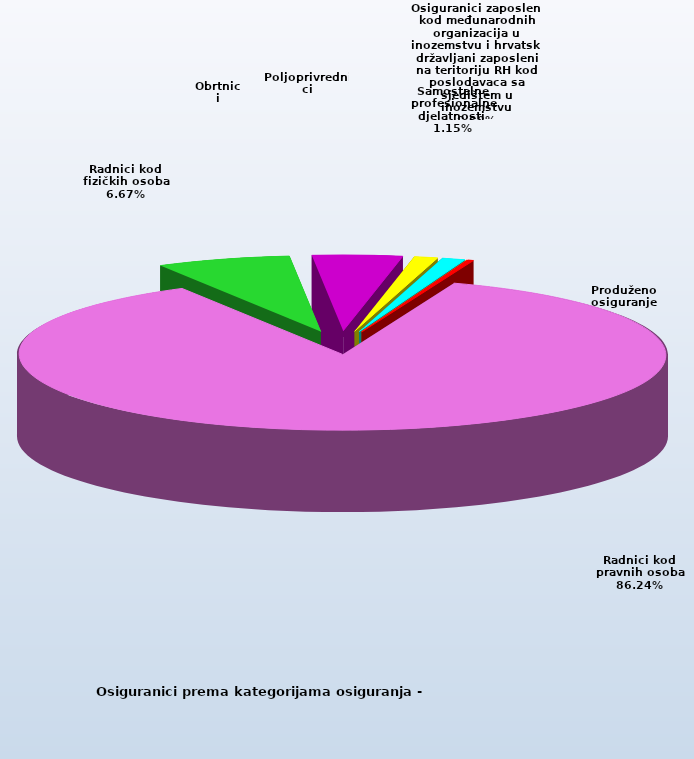
| Category | Series 0 |
|---|---|
| Radnici kod pravnih osoba | 1367615 |
| Radnici kod fizičkih osoba | 105716 |
| Obrtnici | 70872 |
| Poljoprivrednici | 18609 |
| Samostalne profesionalne djelatnosti  | 18222 |
| Osiguranici zaposleni kod međunarodnih organizacija u inozemstvu i hrvatski državljani zaposleni na teritoriju RH kod poslodavaca sa sjedištem u inozemstvu | 60 |
| Produženo osiguranje | 4735 |